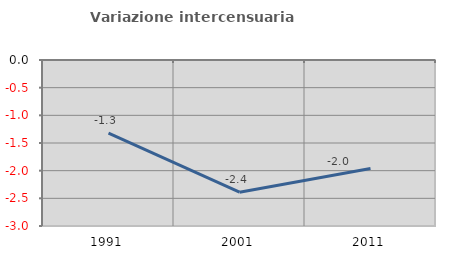
| Category | Variazione intercensuaria annua |
|---|---|
| 1991.0 | -1.32 |
| 2001.0 | -2.388 |
| 2011.0 | -1.961 |